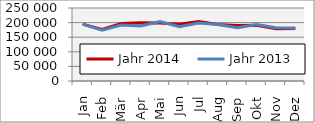
| Category | Jahr 2014 | Jahr 2013 |
|---|---|---|
| Jan | 194791.082 | 194880.755 |
| Feb | 176598.989 | 174076.76 |
| Mär | 197177.609 | 191443.054 |
| Apr | 199548.159 | 188539.544 |
| Mai | 198962.314 | 203447.551 |
| Jun | 194776.055 | 185680.478 |
| Jul | 203840.376 | 198235.662 |
| Aug | 193186.025 | 193544.748 |
| Sep | 190063.541 | 182113.599 |
| Okt | 190712.739 | 193493.483 |
| Nov | 178835.817 | 182229.65 |
| Dez | 179600.136 | 181150.399 |